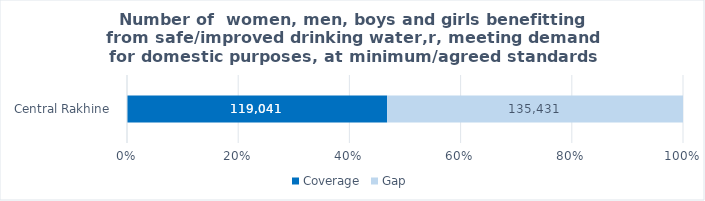
| Category | Coverage |  Gap  |
|---|---|---|
|  Central Rakhine  | 119041 | 135431 |